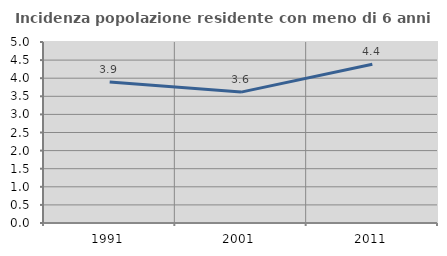
| Category | Incidenza popolazione residente con meno di 6 anni |
|---|---|
| 1991.0 | 3.893 |
| 2001.0 | 3.616 |
| 2011.0 | 4.385 |